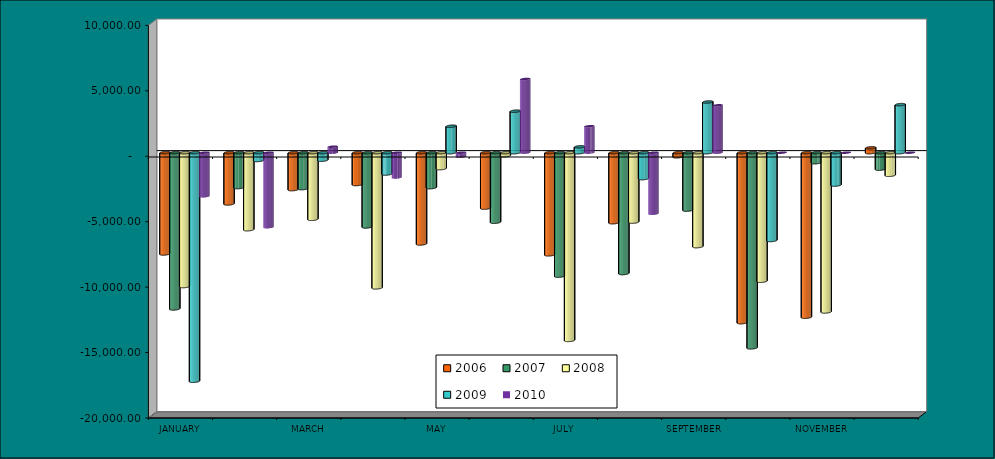
| Category | 2006 | 2007 | 2008 | 2009 | 2010 |
|---|---|---|---|---|---|
| JANUARY | -7737.67 | -11937.29 | -10227.67 | -17466.33 | -3331.041 |
| FEBRUARY | -3915.86 | -2666.95 | -5884.48 | -594.89 | -5690.062 |
| MARCH | -2821.75 | -2743.97 | -5088.35 | -571.61 | 457.754 |
| APRIL | -2433.49 | -5674.19 | -10327.74 | -1628.98 | -1889.15 |
| MAY | -6974.41 | -2671.11 | -1216.32 | 2019 | -302.018 |
| JUNE | -4236.02 | -5313.64 | -232.99 | 3169.13 | 5628.624 |
| JULY | -7804.59 | -9433.07 | -14343.7 | 446.76 | 2018.032 |
| AUGUST | -5351.6 | -9235.06 | -5304.29 | -1981.24 | -4663.655 |
| SEPTEMBER | -312.78 | -4388.62 | -7177.8 | 3871.099 | 3617.43 |
| OCTOBER | -12989.3 | -14914.19 | -9821.17 | -6708.73 | 0 |
| NOVEMBER | -12572.13 | -764.88 | -12168.26 | -2474.567 | 0 |
| DECEMBER | 368.73 | -1260.92 | -1726.45 | 3668.821 | 0 |